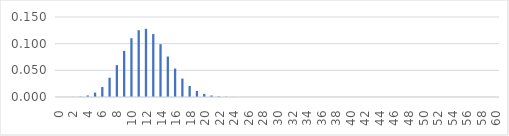
| Category | Series 0 |
|---|---|
| 0.0 | 0 |
| 1.0 | 0 |
| 2.0 | 0 |
| 3.0 | 0.001 |
| 4.0 | 0.003 |
| 5.0 | 0.008 |
| 6.0 | 0.019 |
| 7.0 | 0.036 |
| 8.0 | 0.06 |
| 9.0 | 0.086 |
| 10.0 | 0.11 |
| 11.0 | 0.125 |
| 12.0 | 0.128 |
| 13.0 | 0.118 |
| 14.0 | 0.099 |
| 15.0 | 0.076 |
| 16.0 | 0.053 |
| 17.0 | 0.035 |
| 18.0 | 0.021 |
| 19.0 | 0.011 |
| 20.0 | 0.006 |
| 21.0 | 0.003 |
| 22.0 | 0.001 |
| 23.0 | 0.001 |
| 24.0 | 0 |
| 25.0 | 0 |
| 26.0 | 0 |
| 27.0 | 0 |
| 28.0 | 0 |
| 29.0 | 0 |
| 30.0 | 0 |
| 31.0 | 0 |
| 32.0 | 0 |
| 33.0 | 0 |
| 34.0 | 0 |
| 35.0 | 0 |
| 36.0 | 0 |
| 37.0 | 0 |
| 38.0 | 0 |
| 39.0 | 0 |
| 40.0 | 0 |
| 41.0 | 0 |
| 42.0 | 0 |
| 43.0 | 0 |
| 44.0 | 0 |
| 45.0 | 0 |
| 46.0 | 0 |
| 47.0 | 0 |
| 48.0 | 0 |
| 49.0 | 0 |
| 50.0 | 0 |
| 51.0 | 0 |
| 52.0 | 0 |
| 53.0 | 0 |
| 54.0 | 0 |
| 55.0 | 0 |
| 56.0 | 0 |
| 57.0 | 0 |
| 58.0 | 0 |
| 59.0 | 0 |
| 60.0 | 0 |